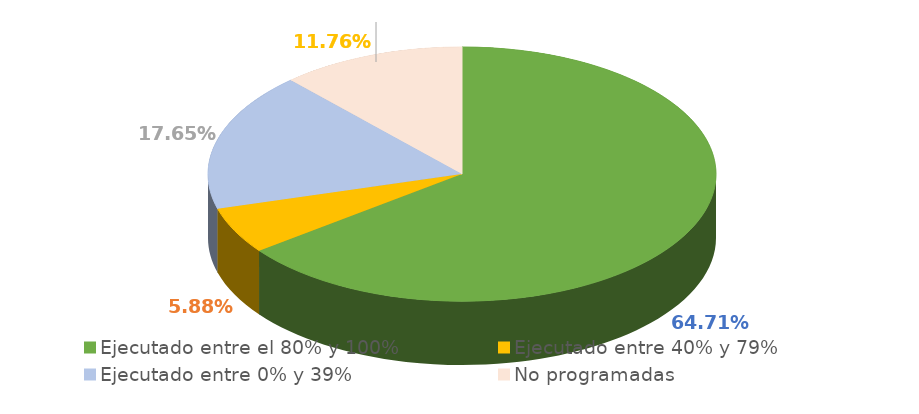
| Category | Series 0 |
|---|---|
| Ejecutado entre el 80% y 100% | 0.647 |
| Ejecutado entre 40% y 79% | 0.059 |
| Ejecutado entre 0% y 39% | 0.176 |
| No programadas | 0.118 |